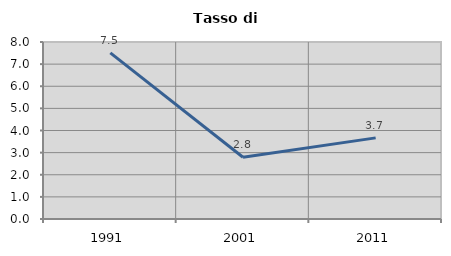
| Category | Tasso di disoccupazione   |
|---|---|
| 1991.0 | 7.508 |
| 2001.0 | 2.791 |
| 2011.0 | 3.666 |